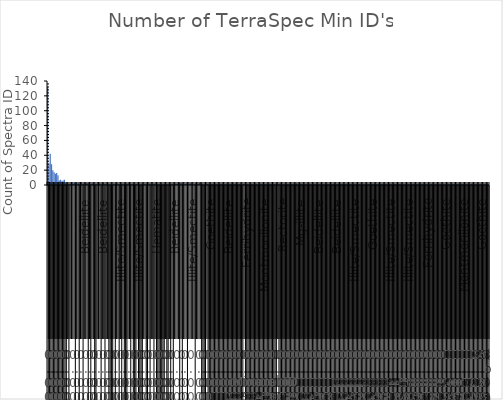
| Category | Total |
|---|---|
| 0 | 132 |
| 1 | 29 |
| 2 | 42 |
| 3 | 28 |
| 4 | 20 |
| 5 | 17 |
| 6 | 15 |
| 7 | 16 |
| 8 | 13 |
| 9 | 6 |
| 10 | 7 |
| 11 | 5 |
| 12 | 6 |
| 13 | 7 |
| 14 | 2 |
| 15 | 1 |
| 16 | 1 |
| 17 | 1 |
| 18 | 1 |
| 19 | 1 |
| 20 | 1 |
| 21 | 3 |
| 22 | 1 |
| 23 | 1 |
| 24 | 2 |
| 25 | 1 |
| 26 | 4 |
| 27 | 1 |
| 28 | 1 |
| 29 | 2 |
| 30 | 2 |
| 31 | 2 |
| 32 | 2 |
| 33 | 1 |
| 34 | 1 |
| 35 | 2 |
| 36 | 1 |
| 37 | 1 |
| 38 | 1 |
| 39 | 1 |
| 40 | 2 |
| 41 | 1 |
| 42 | 1 |
| 43 | 2 |
| 44 | 1 |
| 45 | 1 |
| 46 | 1 |
| 47 | 1 |
| 48 | 1 |
| 49 | 1 |
| 50 | 1 |
| 51 | 1 |
| 52 | 1 |
| 53 | 1 |
| 54 | 1 |
| 55 | 1 |
| 56 | 1 |
| 57 | 1 |
| 58 | 1 |
| 59 | 1 |
| 60 | 1 |
| 61 | 2 |
| 62 | 1 |
| 63 | 2 |
| 64 | 1 |
| 65 | 1 |
| 66 | 1 |
| 67 | 1 |
| 68 | 1 |
| 69 | 1 |
| 70 | 1 |
| 71 | 1 |
| 72 | 1 |
| 73 | 1 |
| 74 | 1 |
| 75 | 1 |
| 76 | 1 |
| 77 | 1 |
| 78 | 1 |
| 79 | 1 |
| 80 | 1 |
| 81 | 1 |
| 82 | 1 |
| 83 | 1 |
| 84 | 1 |
| 85 | 1 |
| 86 | 1 |
| 87 | 1 |
| 88 | 1 |
| 89 | 1 |
| 90 | 1 |
| 91 | 1 |
| 92 | 1 |
| 93 | 1 |
| 94 | 1 |
| 95 | 1 |
| 96 | 1 |
| 97 | 1 |
| 98 | 1 |
| 99 | 1 |
| 100 | 1 |
| 101 | 1 |
| 102 | 3 |
| 103 | 2 |
| 104 | 2 |
| 105 | 1 |
| 106 | 1 |
| 107 | 1 |
| 108 | 1 |
| 109 | 1 |
| 110 | 1 |
| 111 | 2 |
| 112 | 1 |
| 113 | 1 |
| 114 | 1 |
| 115 | 2 |
| 116 | 1 |
| 117 | 1 |
| 118 | 3 |
| 119 | 1 |
| 120 | 1 |
| 121 | 1 |
| 122 | 1 |
| 123 | 1 |
| 124 | 1 |
| 125 | 1 |
| 126 | 1 |
| 127 | 1 |
| 128 | 1 |
| 129 | 1 |
| 130 | 1 |
| 131 | 1 |
| 132 | 1 |
| 133 | 1 |
| 134 | 1 |
| 135 | 1 |
| 136 | 1 |
| 137 | 1 |
| 138 | 1 |
| 139 | 1 |
| 140 | 1 |
| 141 | 1 |
| 142 | 1 |
| 143 | 1 |
| 144 | 2 |
| 145 | 1 |
| 146 | 1 |
| 147 | 1 |
| 148 | 1 |
| 149 | 1 |
| 150 | 1 |
| 151 | 1 |
| 152 | 1 |
| 153 | 1 |
| 154 | 1 |
| 155 | 1 |
| 156 | 1 |
| 157 | 1 |
| 158 | 1 |
| 159 | 1 |
| 160 | 1 |
| 161 | 1 |
| 162 | 1 |
| 163 | 1 |
| 164 | 1 |
| 165 | 1 |
| 166 | 1 |
| 167 | 1 |
| 168 | 1 |
| 169 | 1 |
| 170 | 1 |
| 171 | 1 |
| 172 | 1 |
| 173 | 1 |
| 174 | 1 |
| 175 | 1 |
| 176 | 1 |
| 177 | 1 |
| 178 | 1 |
| 179 | 1 |
| 180 | 1 |
| 181 | 1 |
| 182 | 1 |
| 183 | 1 |
| 184 | 1 |
| 185 | 1 |
| 186 | 1 |
| 187 | 1 |
| 188 | 1 |
| 189 | 1 |
| 190 | 1 |
| 191 | 1 |
| 192 | 1 |
| 193 | 2 |
| 194 | 1 |
| 195 | 1 |
| 196 | 1 |
| 197 | 1 |
| 198 | 1 |
| 199 | 1 |
| 200 | 1 |
| 201 | 1 |
| 202 | 1 |
| 203 | 1 |
| 204 | 1 |
| 205 | 1 |
| 206 | 1 |
| 207 | 1 |
| 208 | 1 |
| 209 | 1 |
| 210 | 1 |
| 211 | 1 |
| 212 | 1 |
| 213 | 1 |
| 214 | 1 |
| 215 | 1 |
| 216 | 1 |
| 217 | 1 |
| 218 | 1 |
| 219 | 1 |
| 220 | 1 |
| 221 | 1 |
| 222 | 1 |
| 223 | 1 |
| 224 | 1 |
| 225 | 1 |
| 226 | 1 |
| 227 | 1 |
| 228 | 1 |
| 229 | 1 |
| 230 | 1 |
| 231 | 1 |
| 232 | 1 |
| 233 | 2 |
| 234 | 1 |
| 235 | 1 |
| 236 | 1 |
| 237 | 1 |
| 238 | 1 |
| 239 | 1 |
| 240 | 1 |
| 241 | 1 |
| 242 | 1 |
| 243 | 1 |
| 244 | 1 |
| 245 | 1 |
| 246 | 1 |
| 247 | 1 |
| 248 | 1 |
| 249 | 1 |
| 250 | 1 |
| 251 | 1 |
| 252 | 1 |
| 253 | 1 |
| 254 | 1 |
| 255 | 1 |
| 256 | 1 |
| 257 | 1 |
| 258 | 1 |
| 259 | 1 |
| 260 | 1 |
| 261 | 1 |
| 262 | 1 |
| 263 | 1 |
| 264 | 1 |
| 265 | 1 |
| 266 | 1 |
| 267 | 1 |
| 268 | 1 |
| 269 | 1 |
| 270 | 1 |
| 271 | 1 |
| 272 | 1 |
| 273 | 1 |
| 274 | 1 |
| 275 | 1 |
| 276 | 1 |
| 277 | 1 |
| 278 | 1 |
| 279 | 1 |
| 280 | 1 |
| 281 | 1 |
| 282 | 1 |
| 283 | 1 |
| 284 | 1 |
| 285 | 1 |
| 286 | 1 |
| 287 | 1 |
| 288 | 1 |
| 289 | 1 |
| 290 | 1 |
| 291 | 1 |
| 292 | 1 |
| 293 | 1 |
| 294 | 1 |
| 295 | 1 |
| 296 | 1 |
| 297 | 1 |
| 298 | 1 |
| 299 | 1 |
| 300 | 1 |
| 301 | 1 |
| 302 | 1 |
| 303 | 1 |
| 304 | 1 |
| 305 | 1 |
| 306 | 1 |
| 307 | 1 |
| 308 | 1 |
| 309 | 1 |
| 310 | 1 |
| 311 | 1 |
| 312 | 1 |
| 313 | 1 |
| 314 | 1 |
| 315 | 1 |
| 316 | 1 |
| 317 | 1 |
| 318 | 1 |
| 319 | 1 |
| 320 | 1 |
| 321 | 1 |
| 322 | 1 |
| 323 | 1 |
| 324 | 1 |
| 325 | 1 |
| 326 | 1 |
| 327 | 1 |
| 328 | 1 |
| 329 | 1 |
| 330 | 1 |
| 331 | 1 |
| 332 | 1 |
| 333 | 1 |
| 334 | 1 |
| 335 | 1 |
| 336 | 1 |
| 337 | 1 |
| 338 | 1 |
| 339 | 1 |
| 340 | 1 |
| 341 | 1 |
| 342 | 1 |